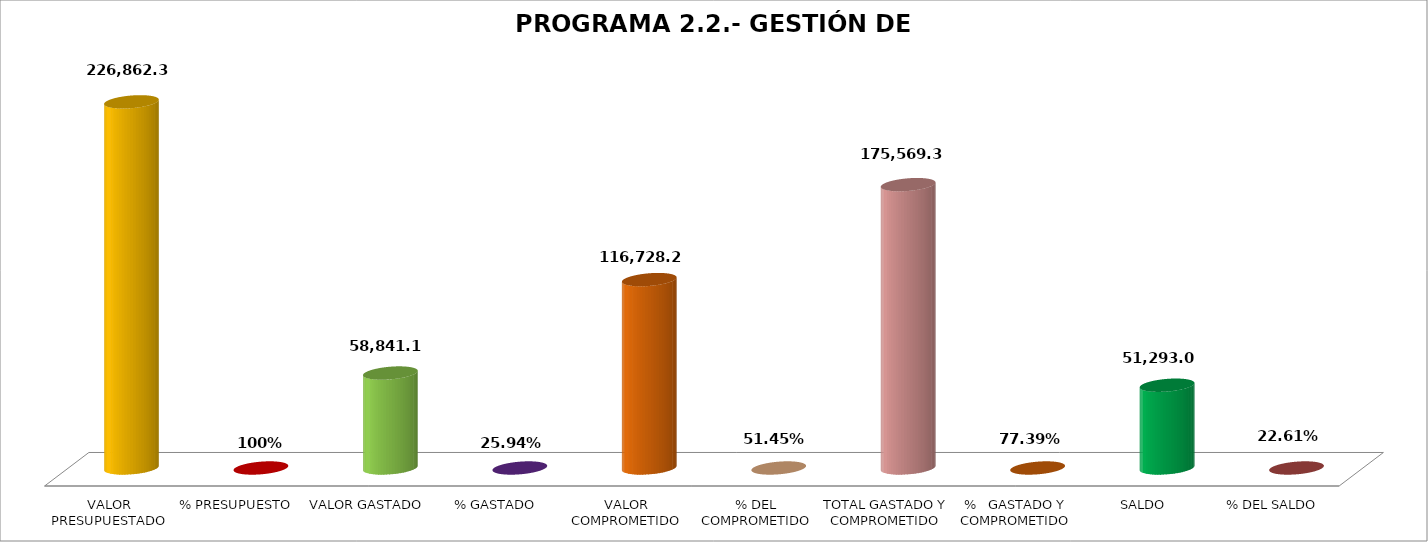
| Category | PROGRAMA 2.2.- GESTIÓN DE TURISMO |
|---|---|
| VALOR PRESUPUESTADO | 226862.39 |
| % PRESUPUESTO | 1 |
| VALOR GASTADO | 58841.12 |
| % GASTADO | 0.259 |
| VALOR COMPROMETIDO | 116728.24 |
| % DEL COMPROMETIDO | 0.515 |
| TOTAL GASTADO Y COMPROMETIDO | 175569.36 |
| %   GASTADO Y COMPROMETIDO | 0.774 |
| SALDO | 51293.03 |
| % DEL SALDO | 0.226 |